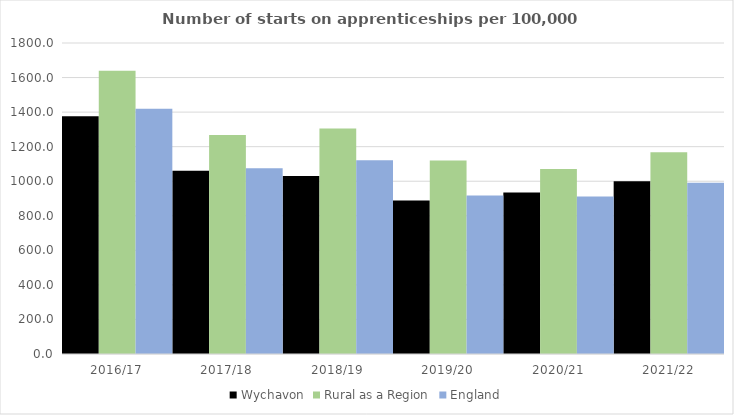
| Category | Wychavon | Rural as a Region | England |
|---|---|---|---|
| 2016/17 | 1376 | 1638.789 | 1420 |
| 2017/18 | 1061 | 1267.474 | 1075 |
| 2018/19 | 1030 | 1304.57 | 1122 |
| 2019/20 | 888 | 1119.662 | 918 |
| 2020/21 | 935 | 1070.748 | 912 |
| 2021/22 | 1000 | 1167.68 | 991 |